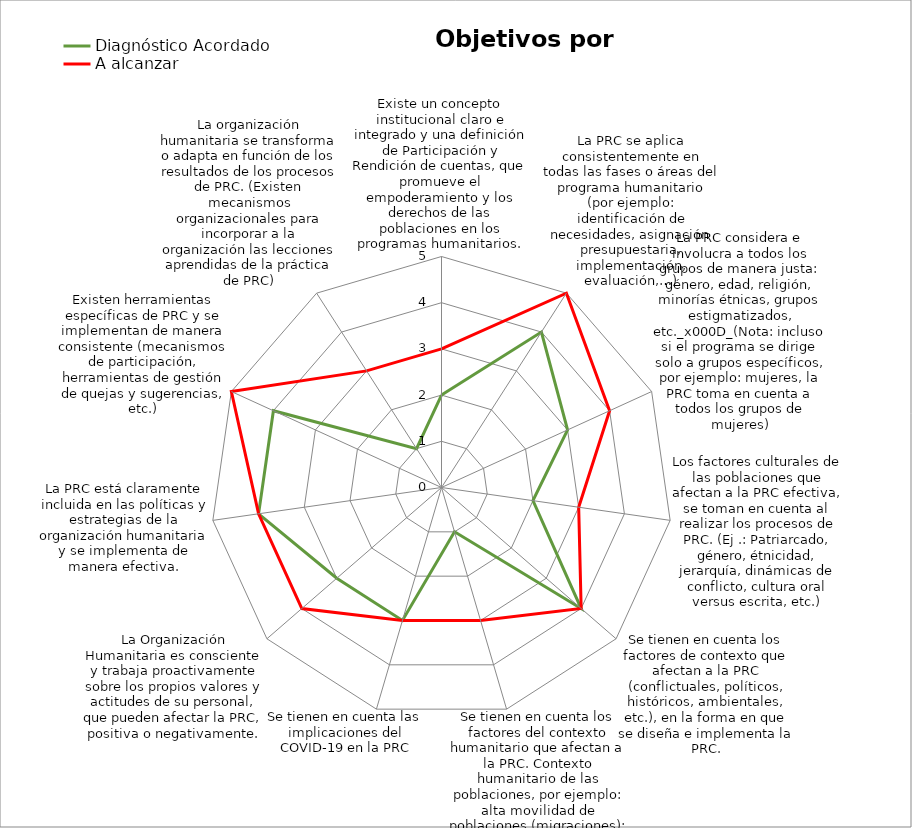
| Category | Diagnóstico Acordado | A alcanzar |
|---|---|---|
| Existe un concepto institucional claro e integrado y una definición de Participación y Rendición de cuentas, que promueve el empoderamiento y los derechos de las poblaciones en los programas humanitarios. | 2 | 3 |
| La PRC se aplica consistentemente en todas las fases o áreas del programa humanitario (por ejemplo: identificación de necesidades, asignación presupuestaria, implementación, evaluación,…) | 4 | 5 |
| La PRC considera e involucra a todos los grupos de manera justa: género, edad, religión, minorías étnicas, grupos estigmatizados, etc._x000d_(Nota: incluso si el programa se dirige solo a grupos específicos, por ejemplo: mujeres, la PRC toma en cuenta a todos l | 3 | 4 |
| Los factores culturales de las poblaciones que afectan a la PRC efectiva, se toman en cuenta al realizar los procesos de PRC. (Ej .: Patriarcado, género, étnicidad, jerarquía, dinámicas de conflicto, cultura oral versus escrita, etc.) | 2 | 3 |
| Se tienen en cuenta los factores de contexto que afectan a la PRC (conflictuales, políticos, históricos, ambientales, etc.), en la forma en que se diseña e implementa la PRC. | 4 | 4 |
| Se tienen en cuenta los factores del contexto humanitario que afectan a la PRC. Contexto humanitario de las poblaciones, por ejemplo: alta movilidad de poblaciones (migraciones); y el contexto de los mecanismos humanitarios existentes, por ejemplo: alta r | 1 | 3 |
| Se tienen en cuenta las implicaciones del COVID-19 en la PRC | 3 | 3 |
| La Organización Humanitaria es consciente y trabaja proactivamente sobre los propios valores y actitudes de su personal, que pueden afectar la PRC, positiva o negativamente. | 3 | 4 |
| La PRC está claramente incluida en las políticas y estrategias de la organización humanitaria y se implementa de manera efectiva. | 4 | 4 |
| Existen herramientas específicas de PRC y se implementan de manera consistente (mecanismos de participación, herramientas de gestión de quejas y sugerencias, etc.) | 4 | 5 |
| La organización humanitaria se transforma o adapta en función de los resultados de los procesos de PRC. (Existen mecanismos organizacionales para incorporar a la organización las lecciones aprendidas de la práctica de PRC) | 1 | 3 |